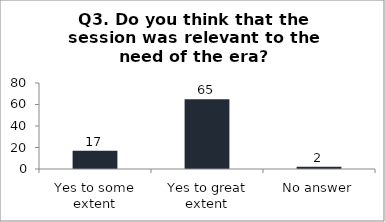
| Category | Q3. Do you think that the session was relevant to the need of the era? |
|---|---|
| Yes to some extent | 17 |
| Yes to great extent | 65 |
| No answer | 2 |